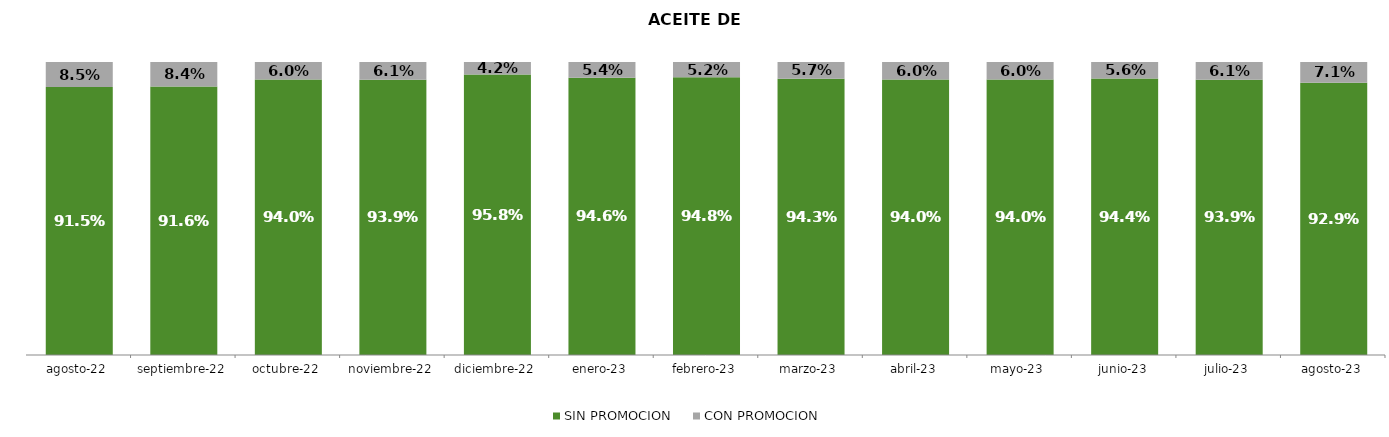
| Category | SIN PROMOCION   | CON PROMOCION   |
|---|---|---|
| 2022-08-01 | 0.915 | 0.085 |
| 2022-09-01 | 0.916 | 0.084 |
| 2022-10-01 | 0.94 | 0.06 |
| 2022-11-01 | 0.939 | 0.061 |
| 2022-12-01 | 0.958 | 0.042 |
| 2023-01-01 | 0.946 | 0.054 |
| 2023-02-01 | 0.948 | 0.052 |
| 2023-03-01 | 0.943 | 0.057 |
| 2023-04-01 | 0.94 | 0.06 |
| 2023-05-01 | 0.94 | 0.06 |
| 2023-06-01 | 0.944 | 0.056 |
| 2023-07-01 | 0.939 | 0.061 |
| 2023-08-01 | 0.929 | 0.071 |